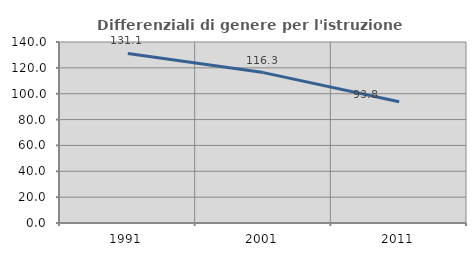
| Category | Differenziali di genere per l'istruzione superiore |
|---|---|
| 1991.0 | 131.129 |
| 2001.0 | 116.331 |
| 2011.0 | 93.797 |